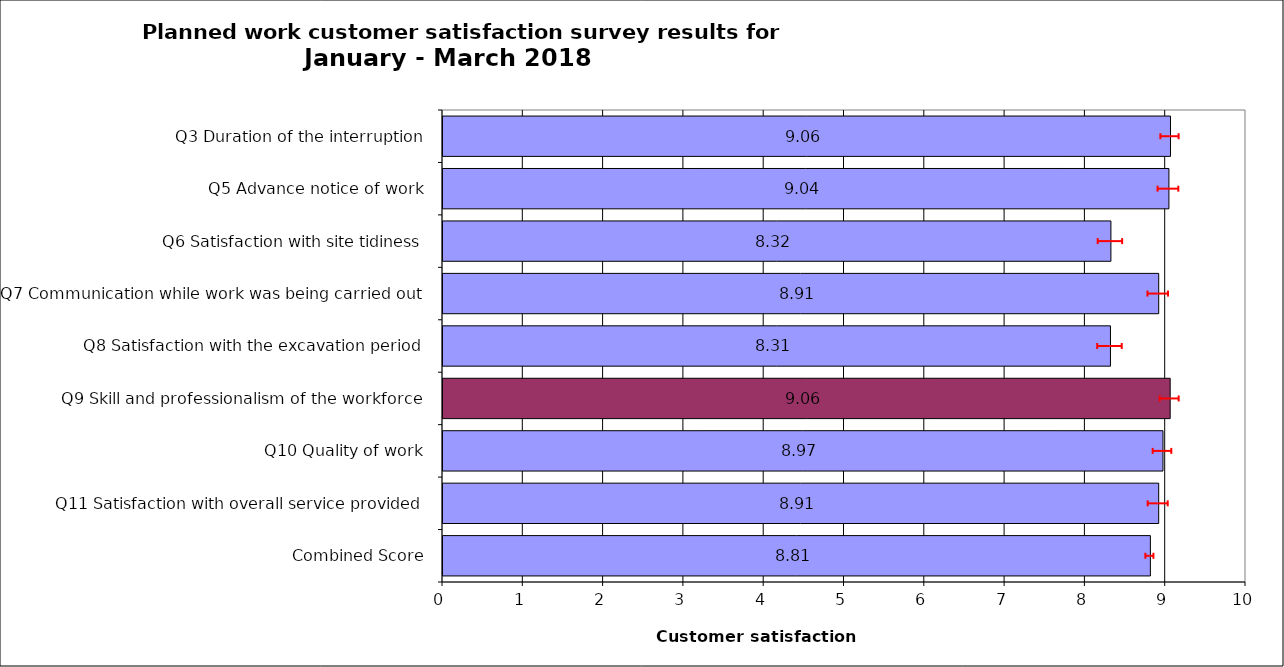
| Category | Series 0 |
|---|---|
| Q3 Duration of the interruption | 9.06 |
| Q5 Advance notice of work | 9.04 |
| Q6 Satisfaction with site tidiness | 8.318 |
| Q7 Communication while work was being carried out | 8.913 |
| Q8 Satisfaction with the excavation period | 8.312 |
| Q9 Skill and professionalism of the workforce | 9.056 |
| Q10 Quality of work | 8.966 |
| Q11 Satisfaction with overall service provided | 8.913 |
| Combined Score | 8.809 |